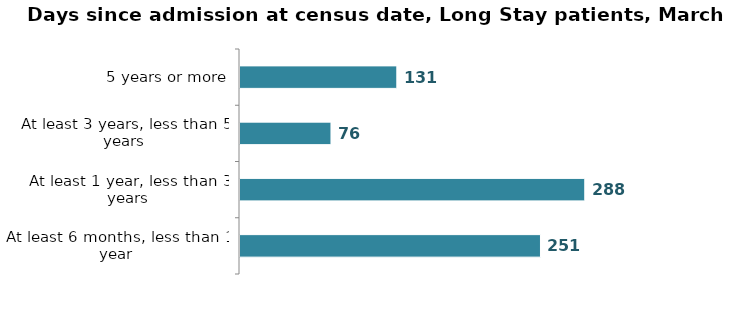
| Category | Series 4 |
|---|---|
| At least 6 months, less than 1 year | 251 |
| At least 1 year, less than 3 years | 288 |
| At least 3 years, less than 5 years | 76 |
| 5 years or more | 131 |